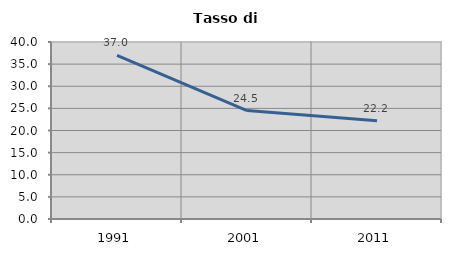
| Category | Tasso di disoccupazione   |
|---|---|
| 1991.0 | 36.977 |
| 2001.0 | 24.518 |
| 2011.0 | 22.179 |